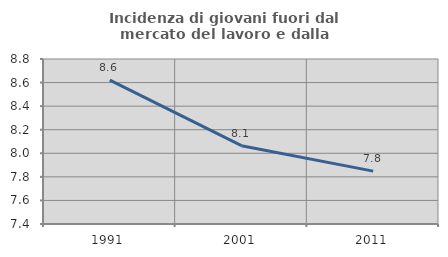
| Category | Incidenza di giovani fuori dal mercato del lavoro e dalla formazione  |
|---|---|
| 1991.0 | 8.621 |
| 2001.0 | 8.065 |
| 2011.0 | 7.849 |